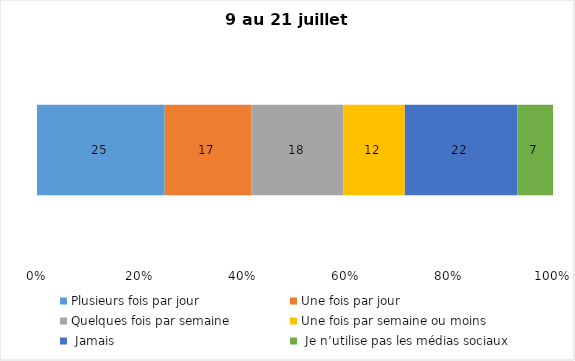
| Category | Plusieurs fois par jour | Une fois par jour | Quelques fois par semaine   | Une fois par semaine ou moins   |  Jamais   |  Je n’utilise pas les médias sociaux |
|---|---|---|---|---|---|---|
| 0 | 25 | 17 | 18 | 12 | 22 | 7 |